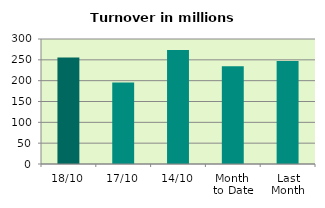
| Category | Series 0 |
|---|---|
| 18/10 | 255.735 |
| 17/10 | 195.686 |
| 14/10 | 273.401 |
| Month 
to Date | 234.861 |
| Last
Month | 247.353 |